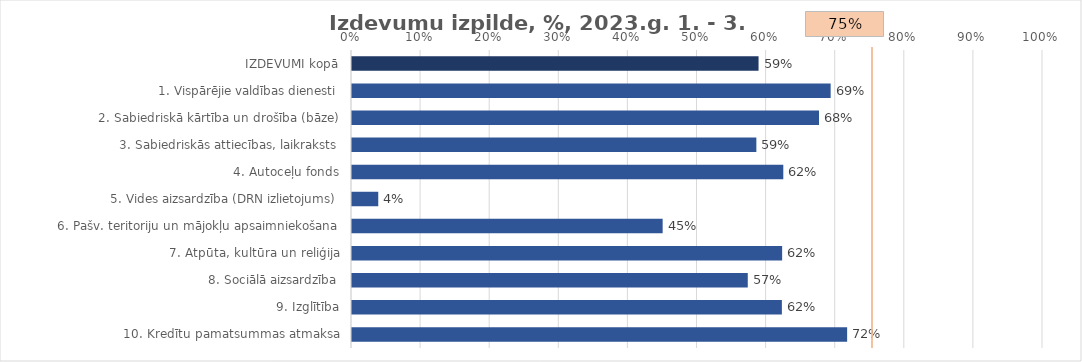
| Category | Izdevumu izpilde, %, 2023.g. 1. - 3. ceturksnis |
|---|---|
| IZDEVUMI kopā | 0.588 |
| 1. Vispārējie valdības dienesti | 0.693 |
| 2. Sabiedriskā kārtība un drošība (bāze) | 0.676 |
| 3. Sabiedriskās attiecības, laikraksts | 0.585 |
| 4. Autoceļu fonds | 0.624 |
| 5. Vides aizsardzība (DRN izlietojums) | 0.038 |
| 6. Pašv. teritoriju un mājokļu apsaimniekošana | 0.45 |
| 7. Atpūta, kultūra un reliģija | 0.622 |
| 8. Sociālā aizsardzība | 0.573 |
| 9. Izglītība | 0.622 |
| 10. Kredītu pamatsummas atmaksa | 0.717 |